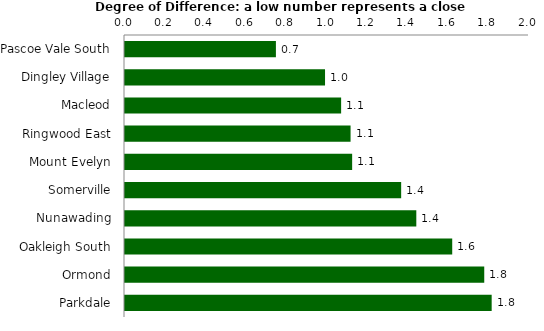
| Category | Series 0 |
|---|---|
| Pascoe Vale South | 0.747 |
| Dingley Village | 0.99 |
| Macleod | 1.07 |
| Ringwood East | 1.117 |
| Mount Evelyn | 1.125 |
| Somerville | 1.367 |
| Nunawading | 1.442 |
| Oakleigh South | 1.62 |
| Ormond | 1.778 |
| Parkdale | 1.815 |